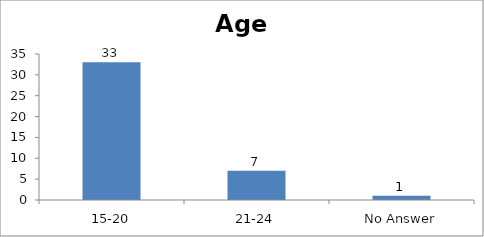
| Category | Age |
|---|---|
| 15-20 | 33 |
| 21-24 | 7 |
| No Answer | 1 |